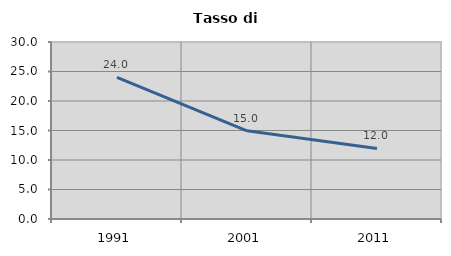
| Category | Tasso di disoccupazione   |
|---|---|
| 1991.0 | 24.023 |
| 2001.0 | 14.951 |
| 2011.0 | 11.959 |